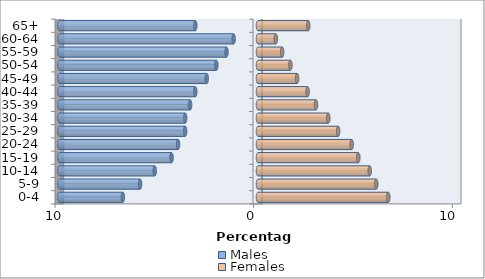
| Category | Males | Females |
|---|---|---|
| 0-4 | -6.802 | 6.558 |
| 5-9 | -5.937 | 5.953 |
| 10-14 | -5.199 | 5.626 |
| 15-19 | -4.35 | 5.049 |
| 20-24 | -4.022 | 4.716 |
| 25-29 | -3.667 | 4.034 |
| 30-34 | -3.667 | 3.54 |
| 35-39 | -3.418 | 2.918 |
| 40-44 | -3.157 | 2.497 |
| 45-49 | -2.58 | 1.97 |
| 50-54 | -2.097 | 1.631 |
| 55-59 | -1.587 | 1.215 |
| 60-64 | -1.226 | 0.899 |
| 65+ | -3.157 | 2.53 |